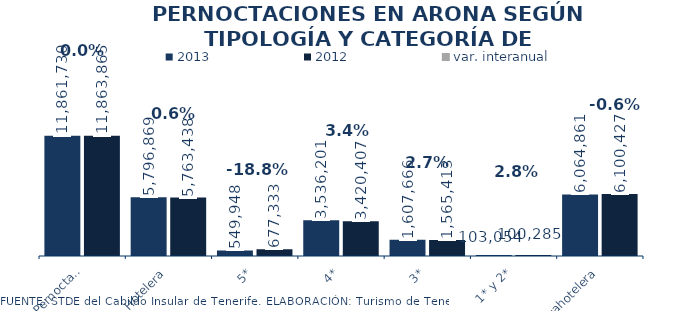
| Category | 2013 | 2012 |
|---|---|---|
| Total Pernoctaciones | 11861730 | 11863865 |
| Hotelera | 5796869 | 5763438 |
| 5* | 549948 | 677333 |
| 4* | 3536201 | 3420407 |
| 3* | 1607666 | 1565413 |
| 1* y 2* | 103054 | 100285 |
| Extrahotelera | 6064861 | 6100427 |